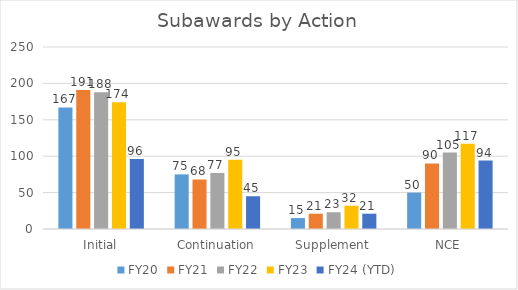
| Category | FY20 | FY21 | FY22 | FY23 | FY24 (YTD) |
|---|---|---|---|---|---|
| Initial | 167 | 191 | 188 | 174 | 96 |
| Continuation | 75 | 68 | 77 | 95 | 45 |
| Supplement | 15 | 21 | 23 | 32 | 21 |
| NCE | 50 | 90 | 105 | 117 | 94 |